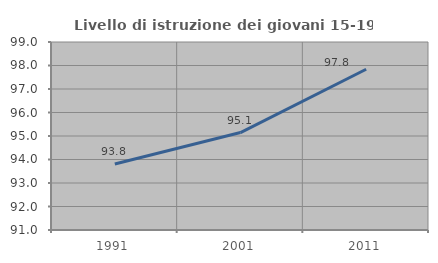
| Category | Livello di istruzione dei giovani 15-19 anni |
|---|---|
| 1991.0 | 93.81 |
| 2001.0 | 95.146 |
| 2011.0 | 97.84 |